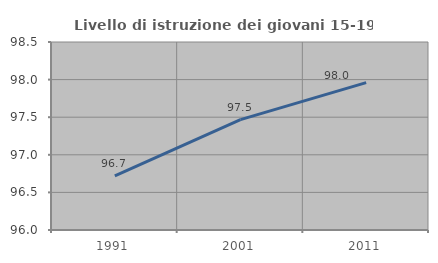
| Category | Livello di istruzione dei giovani 15-19 anni |
|---|---|
| 1991.0 | 96.721 |
| 2001.0 | 97.468 |
| 2011.0 | 97.959 |